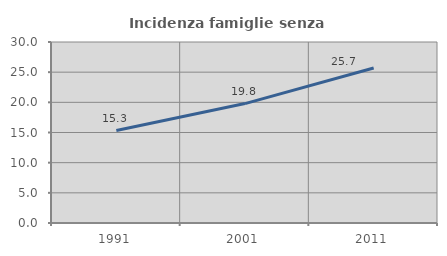
| Category | Incidenza famiglie senza nuclei |
|---|---|
| 1991.0 | 15.328 |
| 2001.0 | 19.792 |
| 2011.0 | 25.689 |